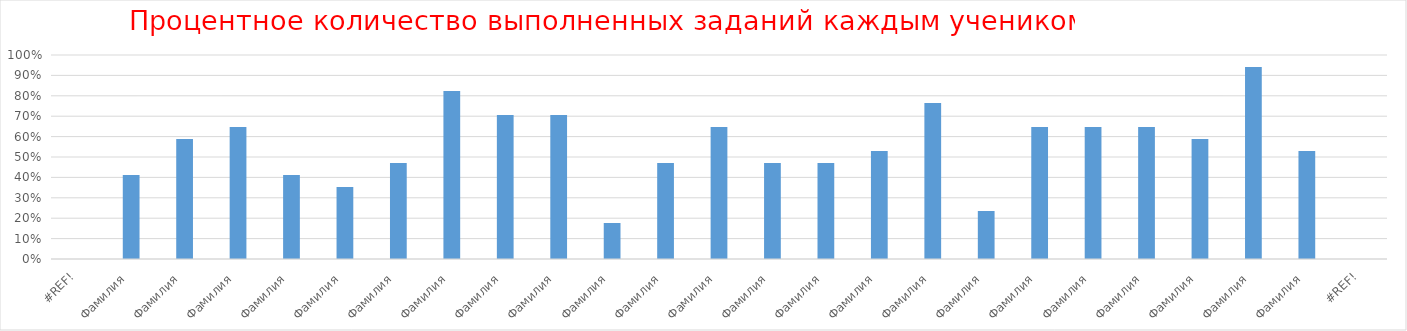
| Category | Series 0 |
|---|---|
| #ССЫЛКА! | 0 |
| Фамилия  | 0.412 |
| Фамилия  | 0.588 |
| Фамилия  | 0.647 |
| Фамилия  | 0.412 |
| Фамилия  | 0.353 |
| Фамилия  | 0.471 |
| Фамилия  | 0.824 |
| Фамилия  | 0.706 |
| Фамилия  | 0.706 |
| Фамилия  | 0.176 |
| Фамилия  | 0.471 |
| Фамилия  | 0.647 |
| Фамилия  | 0.471 |
| Фамилия  | 0.471 |
| Фамилия  | 0.529 |
| Фамилия  | 0.765 |
| Фамилия  | 0.235 |
| Фамилия  | 0.647 |
| Фамилия  | 0.647 |
| Фамилия  | 0.647 |
| Фамилия  | 0.588 |
| Фамилия  | 0.941 |
| Фамилия  | 0.529 |
| #ССЫЛКА! | 0 |